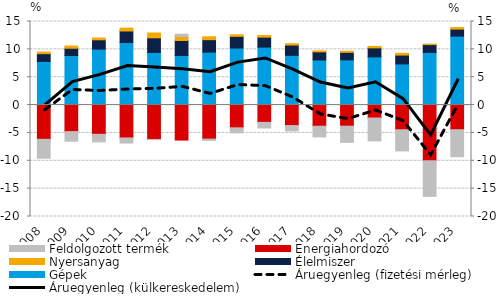
| Category | Gépek | Élelmiszer | Nyersanyag | Energiahordozó | Feldolgozott termék |
|---|---|---|---|---|---|
| 2008.0 | 7.832 | 1.397 | 0.276 | -6.149 | -3.399 |
| 2009.0 | 8.898 | 1.302 | 0.399 | -4.769 | -1.716 |
| 2010.0 | 10.047 | 1.669 | 0.316 | -5.248 | -1.36 |
| 2011.0 | 11.227 | 2.067 | 0.517 | -5.899 | -0.915 |
| 2012.0 | 9.444 | 2.629 | 0.868 | -6.168 | -0.043 |
| 2013.0 | 8.911 | 2.683 | 0.709 | -6.282 | 0.42 |
| 2014.0 | 9.505 | 2.234 | 0.517 | -6.111 | -0.239 |
| 2015.0 | 10.241 | 2.09 | 0.28 | -4.085 | -0.905 |
| 2016.0 | 10.404 | 1.781 | 0.294 | -3.104 | -1.009 |
| 2017.0 | 8.923 | 1.85 | 0.235 | -3.682 | -0.959 |
| 2018.0 | 8.097 | 1.453 | 0.173 | -3.798 | -1.914 |
| 2019.0 | 8.115 | 1.348 | 0.197 | -3.788 | -2.907 |
| 2020.0 | 8.646 | 1.623 | 0.256 | -2.321 | -4.108 |
| 2021.0 | 7.384 | 1.587 | 0.312 | -4.436 | -3.789 |
| 2022.0 | 9.447 | 1.407 | 0.086 | -9.991 | -6.391 |
| 2023.0 | 12.375 | 1.259 | 0.282 | -4.423 | -4.858 |